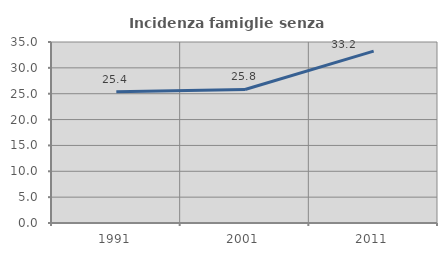
| Category | Incidenza famiglie senza nuclei |
|---|---|
| 1991.0 | 25.365 |
| 2001.0 | 25.822 |
| 2011.0 | 33.241 |